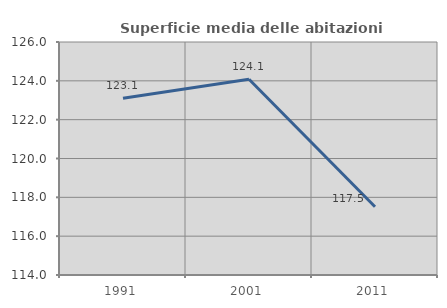
| Category | Superficie media delle abitazioni occupate |
|---|---|
| 1991.0 | 123.1 |
| 2001.0 | 124.081 |
| 2011.0 | 117.515 |